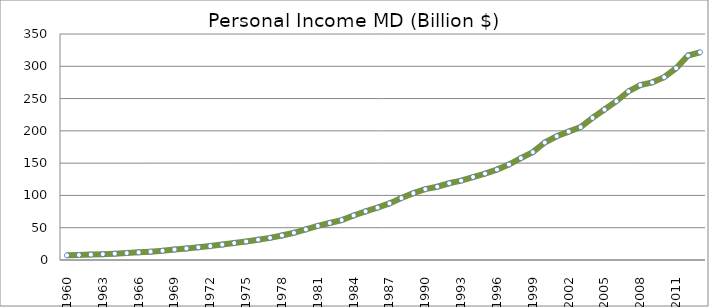
| Category | Series 0 |
|---|---|
| 1960.0 | 7.312 |
| 1961.0 | 7.771 |
| 1962.0 | 8.403 |
| 1963.0 | 8.997 |
| 1964.0 | 9.822 |
| 1965.0 | 10.727 |
| 1966.0 | 11.841 |
| 1967.0 | 12.913 |
| 1968.0 | 14.305 |
| 1969.0 | 16.23 |
| 1970.0 | 17.951 |
| 1971.0 | 19.64 |
| 1972.0 | 21.555 |
| 1973.0 | 23.861 |
| 1974.0 | 26.329 |
| 1975.0 | 28.656 |
| 1976.0 | 31.444 |
| 1977.0 | 34.306 |
| 1978.0 | 38.027 |
| 1979.0 | 42.135 |
| 1980.0 | 47.296 |
| 1981.0 | 52.794 |
| 1982.0 | 57.33 |
| 1983.0 | 61.841 |
| 1984.0 | 68.984 |
| 1985.0 | 75.325 |
| 1986.0 | 81.069 |
| 1987.0 | 87.696 |
| 1988.0 | 95.867 |
| 1989.0 | 103.528 |
| 1990.0 | 109.686 |
| 1991.0 | 113.436 |
| 1992.0 | 118.847 |
| 1993.0 | 122.906 |
| 1994.0 | 128.523 |
| 1995.0 | 133.814 |
| 1996.0 | 140.035 |
| 1997.0 | 147.843 |
| 1998.0 | 157.784 |
| 1999.0 | 167.075 |
| 2000.0 | 181.957 |
| 2001.0 | 191.657 |
| 2002.0 | 198.824 |
| 2003.0 | 205.737 |
| 2004.0 | 220.127 |
| 2005.0 | 232.95 |
| 2006.0 | 245.879 |
| 2007.0 | 261.115 |
| 2008.0 | 270.924 |
| 2009.0 | 275.143 |
| 2010.0 | 283.049 |
| 2011.0 | 296.957 |
| 2012.0 | 316.681 |
| 2013.0 | 321.689 |